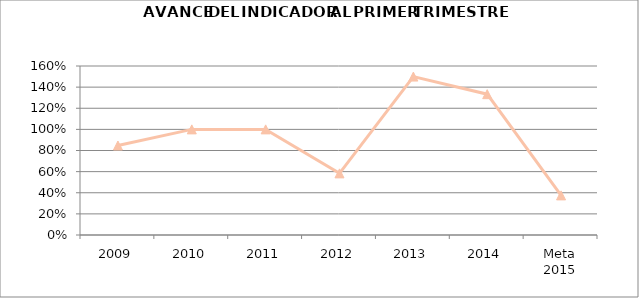
| Category | Series 2 |
|---|---|
| 2009 | 0.847 |
| 2010 | 1 |
| 2011 | 1 |
| 2012 | 0.583 |
| 2013 | 1.5 |
| 2014 | 1.333 |
| Meta 2015 | 0.375 |